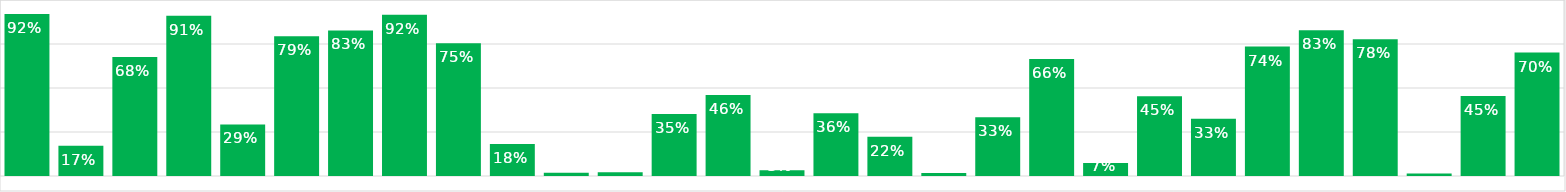
| Category | Series 0 |
|---|---|
| XAUUSD | 0.92 |
| AUDCAD | 0.172 |
| AUDCHF | 0.676 |
| AUDJPY | 0.911 |
| AUDNZD | 0.293 |
| AUDUSD | 0.795 |
| CADCHF | 0.827 |
| CADJPY | 0.917 |
| CHFJPY | 0.754 |
| EURAUD | 0.182 |
| EURCAD | 0.019 |
| EURCHF | 0.021 |
| EURGBP | 0.352 |
| EURJPY | 0.46 |
| EURNZD | 0.032 |
| EURUSD | 0.357 |
| GBPAUD | 0.222 |
| GBPCAD | 0.017 |
| GBPCHF | 0.333 |
| GBPJPY | 0.665 |
| GBPNZD | 0.074 |
| GBPUSD | 0.454 |
| NZDCAD | 0.326 |
| NZDCHF | 0.736 |
| NZDJPY | 0.828 |
| NZDUSD | 0.777 |
| USDCAD | 0.014 |
| USDCHF | 0.455 |
| USDJPY | 0.701 |